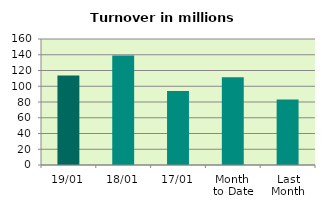
| Category | Series 0 |
|---|---|
| 19/01 | 113.745 |
| 18/01 | 139.013 |
| 17/01 | 93.965 |
| Month 
to Date | 111.413 |
| Last
Month | 83.19 |